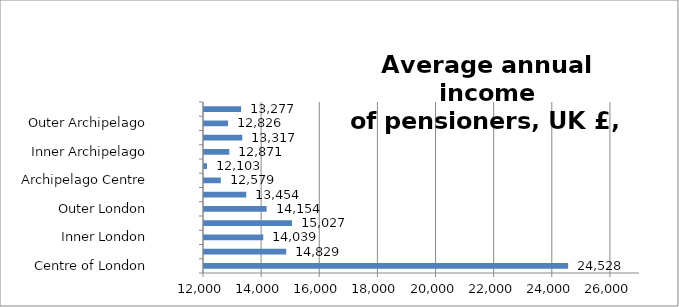
| Category | Series 0 |
|---|---|
| Centre of London | 24527.641 |
| London Core | 14828.67 |
| Inner London | 14038.651 |
| London Suburbs | 15027.216 |
| Outer London | 14153.708 |
| London Edge | 13453.861 |
| Archipelago Centre | 12579.212 |
| Archipelago Core | 12102.87 |
| Inner Archipelago | 12870.751 |
| Archipelago Suburbs | 13316.774 |
| Outer Archipelago | 12825.553 |
| Archipelago Edge | 13277.077 |